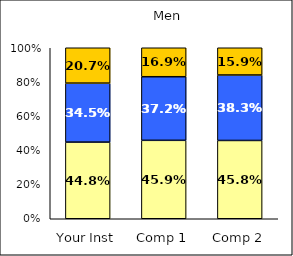
| Category | Low Civic Minded Values | Average Civic Minded Values | High Civic Minded Values |
|---|---|---|---|
| Your Inst | 0.448 | 0.345 | 0.207 |
| Comp 1 | 0.459 | 0.372 | 0.169 |
| Comp 2 | 0.458 | 0.383 | 0.159 |